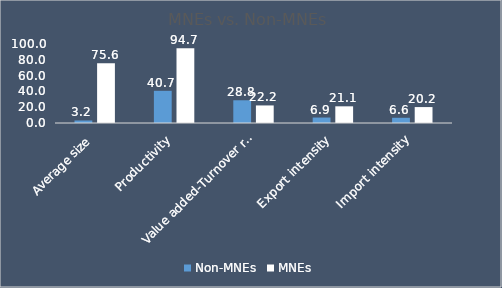
| Category | Non-MNEs | MNEs |
|---|---|---|
| Average size | 3.201 | 75.56 |
| Productivity | 40.748 | 94.711 |
| Value added-Turnover ratio | 28.777 | 22.235 |
| Export intensity | 6.909 | 21.121 |
| Import intensity | 6.593 | 20.163 |